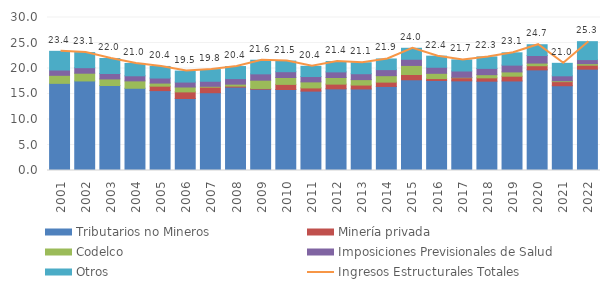
| Category | Tributarios no Mineros | Minería privada | Codelco  | Imposiciones Previsionales de Salud  | Otros |
|---|---|---|---|---|---|
| 2001.0 | 17.088 | 0 | 1.575 | 1.036 | 3.669 |
| 2002.0 | 17.558 | 0 | 1.519 | 1.08 | 2.964 |
| 2003.0 | 16.672 | 0 | 1.284 | 1.065 | 2.945 |
| 2004.0 | 16.125 | 0 | 1.447 | 0.997 | 2.421 |
| 2005.0 | 15.665 | 0.874 | 0.603 | 0.989 | 2.272 |
| 2006.0 | 14.119 | 1.294 | 0.957 | 0.968 | 2.155 |
| 2007.0 | 15.251 | 1.085 | 0.177 | 0.986 | 2.291 |
| 2008.0 | 16.351 | 0.199 | 0.384 | 1.088 | 2.364 |
| 2009.0 | 15.943 | 0.141 | 1.624 | 1.244 | 2.667 |
| 2010.0 | 15.882 | 1.004 | 1.347 | 1.141 | 2.086 |
| 2011.0 | 15.567 | 0.623 | 1.187 | 1.047 | 2.006 |
| 2012.0 | 16.01 | 0.927 | 1.3 | 1.1 | 2.026 |
| 2013.0 | 15.993 | 0.763 | 1.062 | 1.159 | 2.151 |
| 2014.0 | 16.483 | 0.846 | 1.262 | 1.187 | 2.092 |
| 2015.0 | 17.785 | 1.034 | 1.781 | 1.212 | 2.153 |
| 2016.0 | 17.655 | 0.372 | 1.027 | 1.186 | 2.176 |
| 2017.0 | 17.579 | 0.603 | 0.093 | 1.235 | 2.182 |
| 2018.0 | 17.513 | 0.652 | 0.622 | 1.237 | 2.252 |
| 2019.0 | 17.557 | 0.938 | 0.837 | 1.33 | 2.414 |
| 2020.0 | 19.731 | 0.815 | 0.517 | 1.487 | 2.112 |
| 2021.0 | 16.619 | 0.804 | 0.172 | 0.97 | 2.45 |
| 2022.0 | 19.87 | 0.778 | 0.309 | 0.786 | 3.52 |